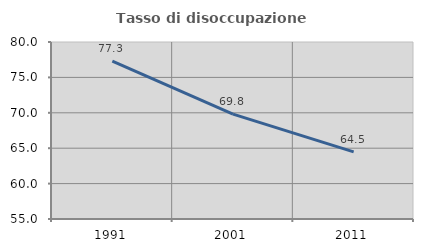
| Category | Tasso di disoccupazione giovanile  |
|---|---|
| 1991.0 | 77.291 |
| 2001.0 | 69.811 |
| 2011.0 | 64.474 |